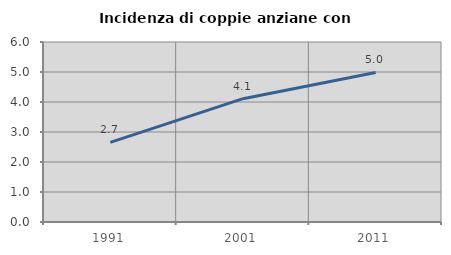
| Category | Incidenza di coppie anziane con figli |
|---|---|
| 1991.0 | 2.653 |
| 2001.0 | 4.11 |
| 2011.0 | 4.986 |